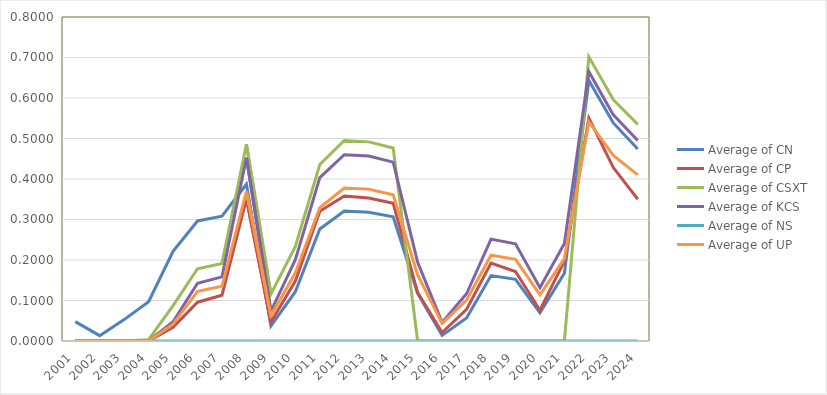
| Category | Average of CN | Average of CP | Average of CSXT | Average of KCS | Average of NS | Average of UP |
|---|---|---|---|---|---|---|
| 2001 | 0.048 | 0 | 0 | 0 | 0 | 0 |
| 2002 | 0.013 | 0 | 0 | 0 | 0 | 0 |
| 2003 | 0.053 | 0 | 0 | 0 | 0 | 0 |
| 2004 | 0.097 | 0 | 0.003 | 0 | 0 | 0 |
| 2005 | 0.222 | 0.034 | 0.088 | 0.048 | 0 | 0.042 |
| 2006 | 0.296 | 0.096 | 0.178 | 0.142 | 0 | 0.122 |
| 2007 | 0.308 | 0.113 | 0.192 | 0.158 | 0 | 0.135 |
| 2008 | 0.387 | 0.351 | 0.486 | 0.453 | 0 | 0.37 |
| 2009 | 0.037 | 0.047 | 0.116 | 0.073 | 0 | 0.062 |
| 2010 | 0.122 | 0.148 | 0.233 | 0.201 | 0 | 0.168 |
| 2011 | 0.277 | 0.321 | 0.436 | 0.403 | 0 | 0.329 |
| 2012 | 0.321 | 0.358 | 0.495 | 0.46 | 0 | 0.377 |
| 2013 | 0.318 | 0.353 | 0.492 | 0.457 | 0 | 0.375 |
| 2014 | 0.307 | 0.34 | 0.477 | 0.442 | 0 | 0.361 |
| 2015 | 0.117 | 0.119 | 0 | 0.194 | 0 | 0.163 |
| 2016 | 0.014 | 0.021 | 0 | 0.046 | 0 | 0.043 |
| 2017 | 0.057 | 0.078 | 0 | 0.117 | 0 | 0.101 |
| 2018 | 0.162 | 0.192 | 0 | 0.252 | 0 | 0.212 |
| 2019 | 0.152 | 0.172 | 0 | 0.24 | 0 | 0.202 |
| 2020 | 0.07 | 0.076 | 0 | 0.132 | 0 | 0.114 |
| 2021 | 0.167 | 0.198 | 0 | 0.241 | 0 | 0.203 |
| 2022 | 0.643 | 0.551 | 0.702 | 0.665 | 0 | 0.542 |
| 2023 | 0.538 | 0.428 | 0.596 | 0.558 | 0 | 0.458 |
| 2024 | 0.474 | 0.35 | 0.535 | 0.495 | 0 | 0.41 |